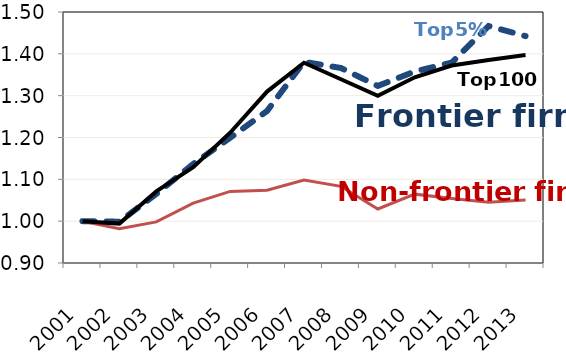
| Category | Average | Non-frontier (ORBIS) | Series 0 |
|---|---|---|---|
| 2001.0 | 1 | 1 | 1 |
| 2002.0 | 0.999 | 0.982 | 0.994 |
| 2003.0 | 1.065 | 0.998 | 1.071 |
| 2004.0 | 1.137 | 1.043 | 1.129 |
| 2005.0 | 1.199 | 1.071 | 1.211 |
| 2006.0 | 1.263 | 1.074 | 1.31 |
| 2007.0 | 1.381 | 1.098 | 1.379 |
| 2008.0 | 1.366 | 1.083 | 1.339 |
| 2009.0 | 1.323 | 1.029 | 1.3 |
| 2010.0 | 1.358 | 1.065 | 1.344 |
| 2011.0 | 1.379 | 1.054 | 1.372 |
| 2012.0 | 1.466 | 1.045 | 1.385 |
| 2013.0 | 1.442 | 1.05 | 1.397 |